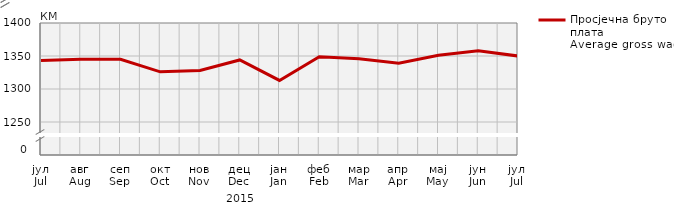
| Category | Просјечна бруто плата
Average gross wage |
|---|---|
| јул
Jul | 1343 |
| авг
Aug | 1345 |
| сеп
Sep | 1345 |
| окт
Oct | 1326 |
| нов
Nov | 1328 |
| дец
Dec | 1344 |
| јан
Jan | 1313 |
| феб
Feb | 1349 |
| мар
Mar | 1346 |
| апр
Apr | 1339 |
| мај
May | 1351 |
| јун
Jun | 1358 |
| јул
Jul | 1350 |